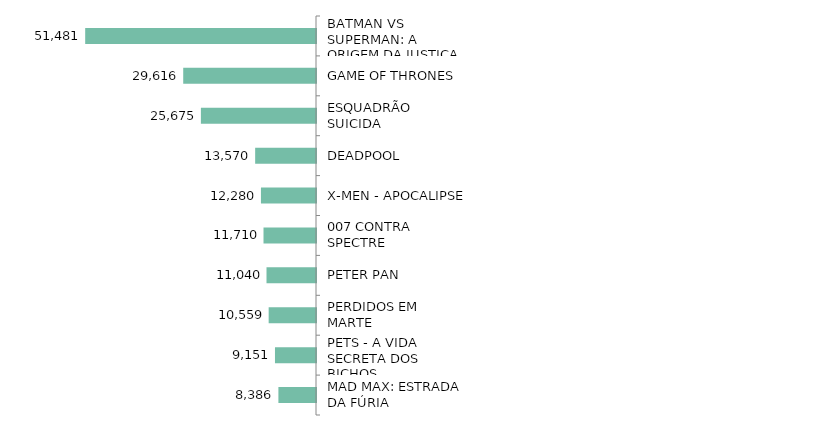
| Category | Series 0 |
|---|---|
| BATMAN VS SUPERMAN: A ORIGEM DA JUSTIÇA | 51481 |
| GAME OF THRONES | 29616 |
| ESQUADRÃO SUICIDA | 25675 |
| DEADPOOL | 13570 |
| X-MEN - APOCALIPSE | 12280 |
| 007 CONTRA SPECTRE | 11710 |
| PETER PAN | 11040 |
| PERDIDOS EM MARTE | 10559 |
| PETS - A VIDA SECRETA DOS BICHOS | 9151 |
| MAD MAX: ESTRADA DA FÚRIA | 8386 |